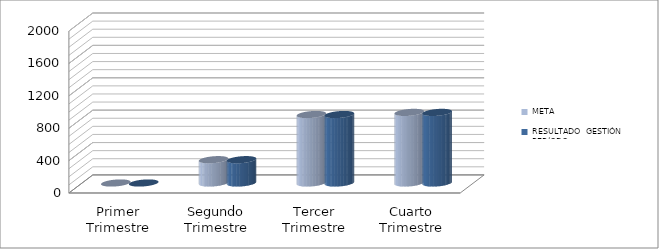
| Category | META | RESULTADO  GESTIÓN PERÍODO |
|---|---|---|
| Primer Trimestre | 0 | 0 |
| Segundo Trimestre | 288 | 288 |
| Tercer Trimestre | 846 | 846 |
| Cuarto Trimestre | 872 | 872 |